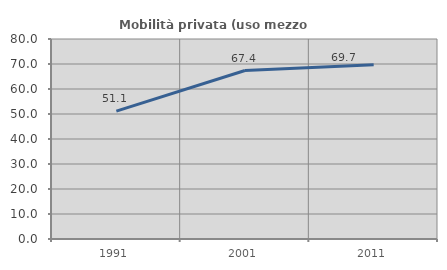
| Category | Mobilità privata (uso mezzo privato) |
|---|---|
| 1991.0 | 51.135 |
| 2001.0 | 67.381 |
| 2011.0 | 69.737 |